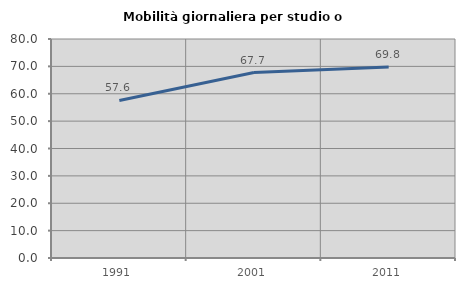
| Category | Mobilità giornaliera per studio o lavoro |
|---|---|
| 1991.0 | 57.557 |
| 2001.0 | 67.745 |
| 2011.0 | 69.756 |